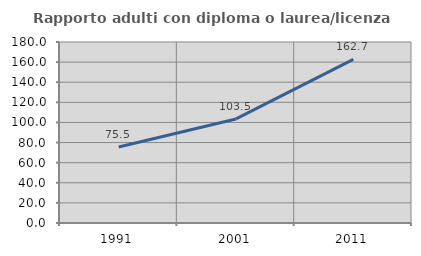
| Category | Rapporto adulti con diploma o laurea/licenza media  |
|---|---|
| 1991.0 | 75.515 |
| 2001.0 | 103.505 |
| 2011.0 | 162.661 |